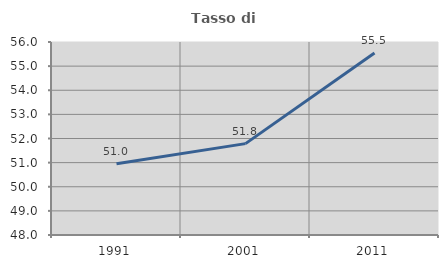
| Category | Tasso di occupazione   |
|---|---|
| 1991.0 | 50.957 |
| 2001.0 | 51.788 |
| 2011.0 | 55.544 |